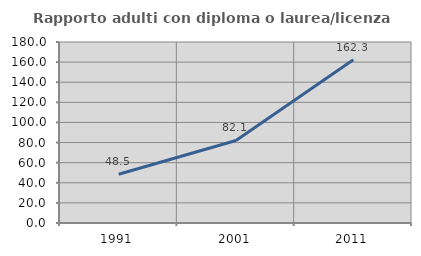
| Category | Rapporto adulti con diploma o laurea/licenza media  |
|---|---|
| 1991.0 | 48.515 |
| 2001.0 | 82.09 |
| 2011.0 | 162.333 |